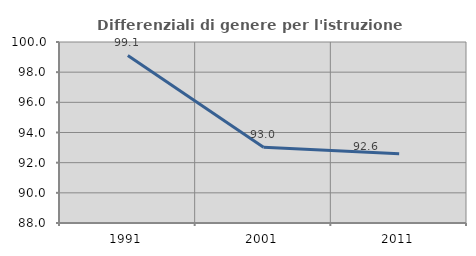
| Category | Differenziali di genere per l'istruzione superiore |
|---|---|
| 1991.0 | 99.109 |
| 2001.0 | 93.019 |
| 2011.0 | 92.592 |